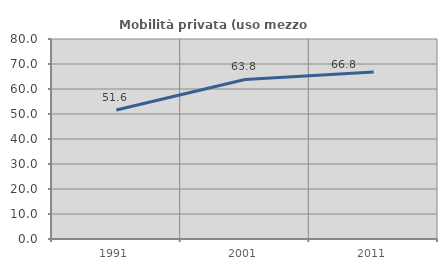
| Category | Mobilità privata (uso mezzo privato) |
|---|---|
| 1991.0 | 51.626 |
| 2001.0 | 63.83 |
| 2011.0 | 66.832 |